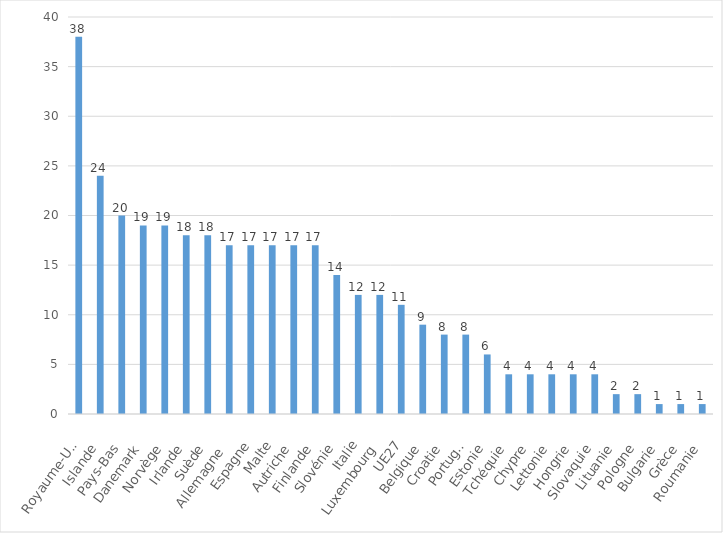
| Category | Particuliers ayant utilisé des assistants virtuels sous forme d'une enceinte intelligente ou d'une application |
|---|---|
| Royaume-Uni | 38 |
| Islande | 24 |
| Pays-Bas | 20 |
| Danemark | 19 |
| Norvège | 19 |
| Irlande | 18 |
| Suède | 18 |
| Allemagne  | 17 |
| Espagne | 17 |
| Malte | 17 |
| Autriche | 17 |
| Finlande | 17 |
| Slovénie | 14 |
| Italie | 12 |
| Luxembourg | 12 |
| UE27 | 11 |
| Belgique | 9 |
| Croatie | 8 |
| Portugal | 8 |
| Estonie | 6 |
| Tchéquie | 4 |
| Chypre | 4 |
| Lettonie | 4 |
| Hongrie | 4 |
| Slovaquie | 4 |
| Lituanie | 2 |
| Pologne | 2 |
| Bulgarie | 1 |
| Grèce | 1 |
| Roumanie | 1 |